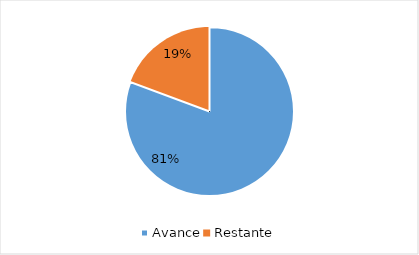
| Category | Series 0 |
|---|---|
| Avance | 0.807 |
| Restante | 0.193 |